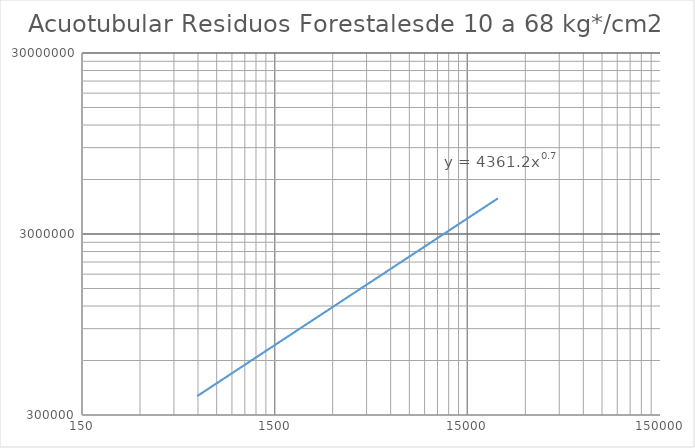
| Category | 1 |
|---|---|
| 600.0 | 383981.363 |
| 850.0 | 490001.623 |
| 1100.0 | 586920.326 |
| 1350.0 | 677388.639 |
| 1600.0 | 762936.264 |
| 1850.0 | 844548.277 |
| 2100.0 | 922906.653 |
| 2350.0 | 998508.518 |
| 2600.0 | 1071730.558 |
| 2850.0 | 1142866.946 |
| 3100.0 | 1212153.043 |
| 3350.0 | 1279780.932 |
| 3600.0 | 1345910.003 |
| 3850.0 | 1410674.386 |
| 4100.0 | 1474188.334 |
| 4350.0 | 1536550.188 |
| 4600.0 | 1597845.384 |
| 4850.0 | 1658148.748 |
| 5100.0 | 1717526.29 |
| 5350.0 | 1776036.626 |
| 5600.0 | 1833732.107 |
| 5850.0 | 1890659.741 |
| 6100.0 | 1946861.939 |
| 6350.0 | 2002377.138 |
| 6600.0 | 2057240.309 |
| 6850.0 | 2111483.395 |
| 7100.0 | 2165135.667 |
| 7350.0 | 2218224.04 |
| 7600.0 | 2270773.33 |
| 7850.0 | 2322806.486 |
| 8100.0 | 2374344.781 |
| 8350.0 | 2425407.986 |
| 8600.0 | 2476014.514 |
| 8850.0 | 2526181.555 |
| 9100.0 | 2575925.183 |
| 9350.0 | 2625260.462 |
| 9600.0 | 2674201.533 |
| 9850.0 | 2722761.692 |
| 10100.0 | 2770953.462 |
| 10350.0 | 2818788.657 |
| 10600.0 | 2866278.434 |
| 10850.0 | 2913433.348 |
| 11100.0 | 2960263.398 |
| 11350.0 | 3006778.065 |
| 11600.0 | 3052986.351 |
| 11850.0 | 3098896.814 |
| 12100.0 | 3144517.598 |
| 12350.0 | 3189856.459 |
| 12600.0 | 3234920.796 |
| 12850.0 | 3279717.67 |
| 13100.0 | 3324253.826 |
| 13350.0 | 3368535.715 |
| 13600.0 | 3412569.51 |
| 13850.0 | 3456361.124 |
| 14100.0 | 3499916.226 |
| 14350.0 | 3543240.252 |
| 14600.0 | 3586338.425 |
| 14850.0 | 3629215.757 |
| 15100.0 | 3671877.072 |
| 15350.0 | 3714327.008 |
| 15600.0 | 3756570.028 |
| 15850.0 | 3798610.434 |
| 16100.0 | 3840452.372 |
| 16350.0 | 3882099.838 |
| 16600.0 | 3923556.69 |
| 16850.0 | 3964826.651 |
| 17100.0 | 4005913.318 |
| 17350.0 | 4046820.168 |
| 17600.0 | 4087550.561 |
| 17850.0 | 4128107.751 |
| 18100.0 | 4168494.883 |
| 18350.0 | 4208715.005 |
| 18600.0 | 4248771.069 |
| 18850.0 | 4288665.937 |
| 19100.0 | 4328402.382 |
| 19350.0 | 4367983.094 |
| 19600.0 | 4407410.685 |
| 19850.0 | 4446687.689 |
| 20100.0 | 4485816.566 |
| 20350.0 | 4524799.708 |
| 20600.0 | 4563639.438 |
| 20850.0 | 4602338.014 |
| 21100.0 | 4640897.633 |
| 21350.0 | 4679320.431 |
| 21600.0 | 4717608.487 |